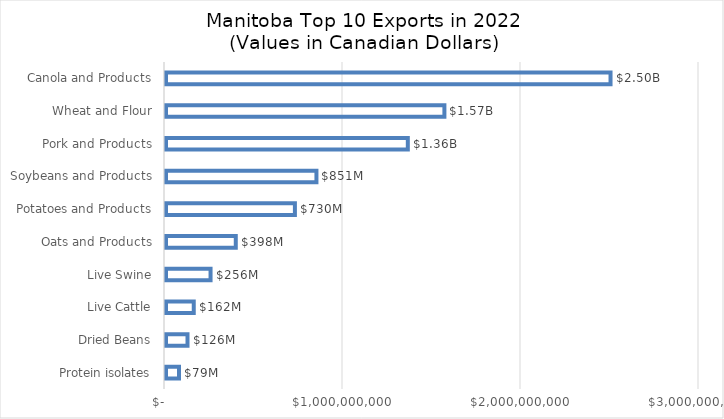
| Category | CAD Dollar |
|---|---|
| Protein isolates | 78832388 |
| Dried Beans | 126423453 |
| Live Cattle | 161521365 |
| Live Swine | 255917838 |
| Oats and Products | 397623057 |
| Potatoes and Products | 729795499 |
| Soybeans and Products | 850780207 |
| Pork and Products | 1364119411 |
| Wheat and Flour | 1569690635 |
| Canola and Products | 2502981837 |